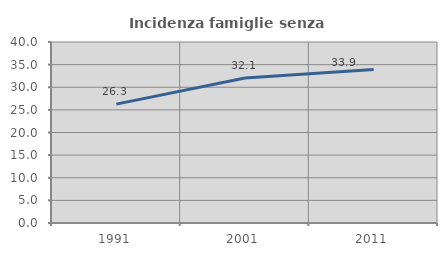
| Category | Incidenza famiglie senza nuclei |
|---|---|
| 1991.0 | 26.267 |
| 2001.0 | 32.062 |
| 2011.0 | 33.917 |